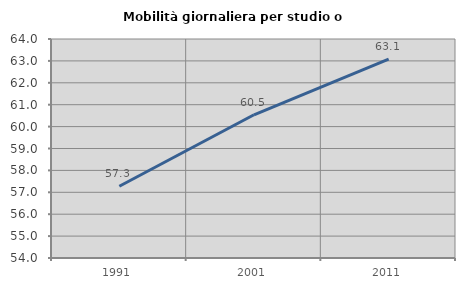
| Category | Mobilità giornaliera per studio o lavoro |
|---|---|
| 1991.0 | 57.277 |
| 2001.0 | 60.541 |
| 2011.0 | 63.084 |